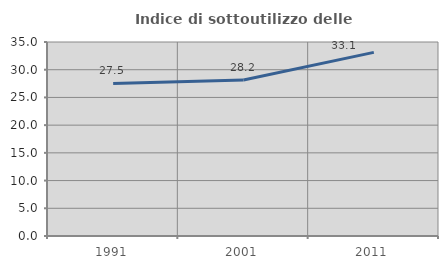
| Category | Indice di sottoutilizzo delle abitazioni  |
|---|---|
| 1991.0 | 27.528 |
| 2001.0 | 28.152 |
| 2011.0 | 33.126 |